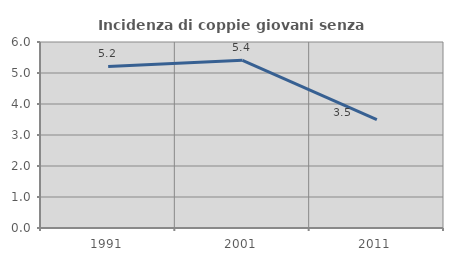
| Category | Incidenza di coppie giovani senza figli |
|---|---|
| 1991.0 | 5.21 |
| 2001.0 | 5.408 |
| 2011.0 | 3.497 |